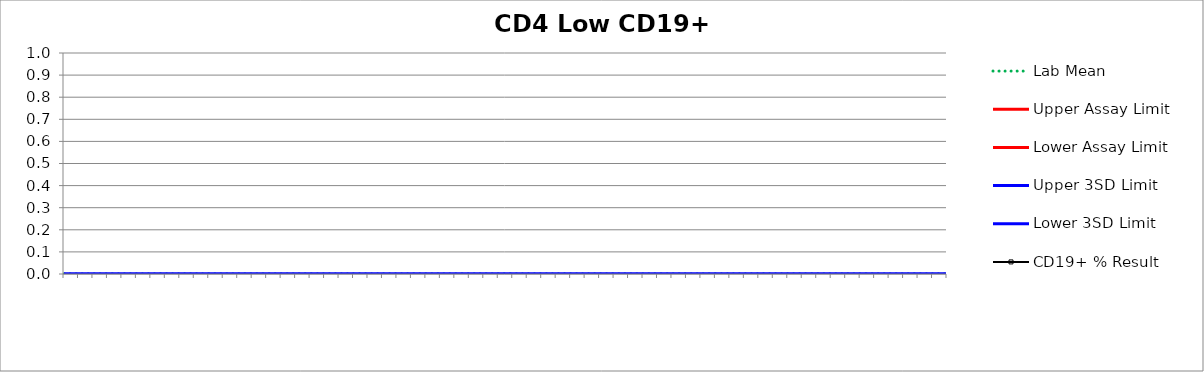
| Category | Lab Mean | Upper Assay Limit | Lower Assay Limit | Upper 3SD Limit | Lower 3SD Limit | CD19+ % Result |
|---|---|---|---|---|---|---|
|  | 0 |  |  | 0 | 0 |  |
|  | 0 |  |  | 0 | 0 |  |
|  | 0 |  |  | 0 | 0 |  |
|  | 0 |  |  | 0 | 0 |  |
|  | 0 |  |  | 0 | 0 |  |
|  | 0 |  |  | 0 | 0 |  |
|  | 0 |  |  | 0 | 0 |  |
|  | 0 |  |  | 0 | 0 |  |
|  | 0 |  |  | 0 | 0 |  |
|  | 0 |  |  | 0 | 0 |  |
|  | 0 |  |  | 0 | 0 |  |
|  | 0 |  |  | 0 | 0 |  |
|  | 0 |  |  | 0 | 0 |  |
|  | 0 |  |  | 0 | 0 |  |
|  | 0 |  |  | 0 | 0 |  |
|  | 0 |  |  | 0 | 0 |  |
|  | 0 |  |  | 0 | 0 |  |
|  | 0 |  |  | 0 | 0 |  |
|  | 0 |  |  | 0 | 0 |  |
|  | 0 |  |  | 0 | 0 |  |
|  | 0 |  |  | 0 | 0 |  |
|  | 0 |  |  | 0 | 0 |  |
|  | 0 |  |  | 0 | 0 |  |
|  | 0 |  |  | 0 | 0 |  |
|  | 0 |  |  | 0 | 0 |  |
|  | 0 |  |  | 0 | 0 |  |
|  | 0 |  |  | 0 | 0 |  |
|  | 0 |  |  | 0 | 0 |  |
|  | 0 |  |  | 0 | 0 |  |
|  | 0 |  |  | 0 | 0 |  |
|  | 0 |  |  | 0 | 0 |  |
|  | 0 |  |  | 0 | 0 |  |
|  | 0 |  |  | 0 | 0 |  |
|  | 0 |  |  | 0 | 0 |  |
|  | 0 |  |  | 0 | 0 |  |
|  | 0 |  |  | 0 | 0 |  |
|  | 0 |  |  | 0 | 0 |  |
|  | 0 |  |  | 0 | 0 |  |
|  | 0 |  |  | 0 | 0 |  |
|  | 0 |  |  | 0 | 0 |  |
|  | 0 |  |  | 0 | 0 |  |
|  | 0 |  |  | 0 | 0 |  |
|  | 0 |  |  | 0 | 0 |  |
|  | 0 |  |  | 0 | 0 |  |
|  | 0 |  |  | 0 | 0 |  |
|  | 0 |  |  | 0 | 0 |  |
|  | 0 |  |  | 0 | 0 |  |
|  | 0 |  |  | 0 | 0 |  |
|  | 0 |  |  | 0 | 0 |  |
|  | 0 |  |  | 0 | 0 |  |
|  | 0 |  |  | 0 | 0 |  |
|  | 0 |  |  | 0 | 0 |  |
|  | 0 |  |  | 0 | 0 |  |
|  | 0 |  |  | 0 | 0 |  |
|  | 0 |  |  | 0 | 0 |  |
|  | 0 |  |  | 0 | 0 |  |
|  | 0 |  |  | 0 | 0 |  |
|  | 0 |  |  | 0 | 0 |  |
|  | 0 |  |  | 0 | 0 |  |
|  | 0 |  |  | 0 | 0 |  |
|  | 0 |  |  | 0 | 0 |  |
|  | 0 |  |  | 0 | 0 |  |